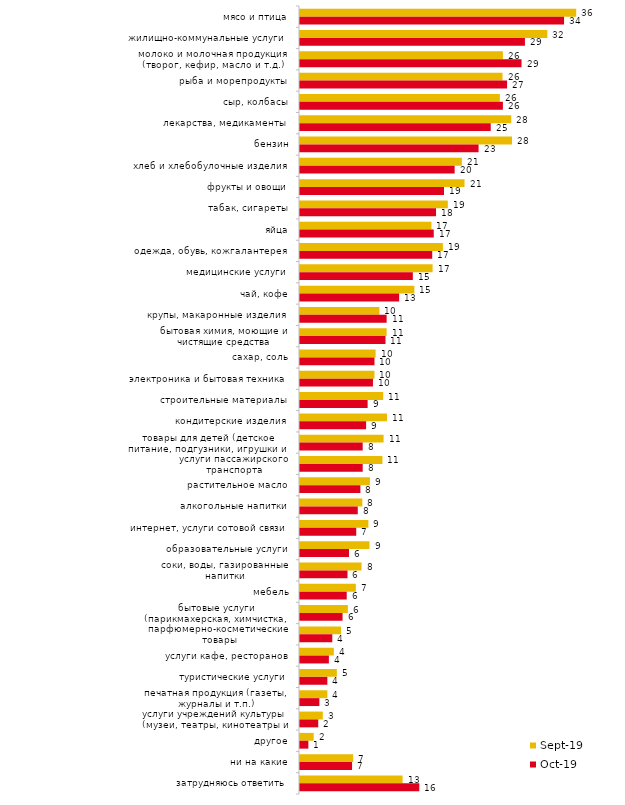
| Category | сен.19 | окт.19 |
|---|---|---|
| мясо и птица | 35.99 | 34.406 |
| жилищно-коммунальные услуги | 32.228 | 29.307 |
| молоко и молочная продукция (творог, кефир, масло и т.д.) | 26.436 | 28.861 |
| рыба и морепродукты | 26.386 | 26.98 |
| сыр, колбасы | 26.04 | 26.436 |
| лекарства, медикаменты | 27.525 | 24.851 |
| бензин | 27.624 | 23.267 |
| хлеб и хлебобулочные изделия | 21.089 | 20.149 |
| фрукты и овощи | 21.436 | 18.762 |
| табак, сигареты | 19.257 | 17.723 |
| яйца | 17.129 | 17.426 |
| одежда, обувь, кожгалантерея | 18.614 | 17.228 |
| медицинские услуги | 17.277 | 14.703 |
| чай, кофе | 14.901 | 12.921 |
| крупы, макаронные изделия | 10.347 | 11.287 |
| бытовая химия, моющие и чистящие средства | 11.287 | 11.139 |
| сахар, соль | 9.851 | 9.703 |
| электроника и бытовая техника | 9.703 | 9.505 |
| строительные материалы | 10.842 | 8.812 |
| кондитерские изделия | 11.337 | 8.614 |
| товары для детей (детское питание, подгузники, игрушки и т.п.) | 10.891 | 8.168 |
| услуги пассажирского транспорта | 10.743 | 8.168 |
| растительное масло | 9.109 | 7.871 |
| алкогольные напитки | 8.119 | 7.525 |
| интернет, услуги сотовой связи | 8.911 | 7.327 |
| образовательные услуги | 9.059 | 6.386 |
| соки, воды, газированные напитки | 8.02 | 6.188 |
| мебель | 7.277 | 6.089 |
| бытовые услуги (парикмахерская, химчистка, ателье и т.д.) | 6.238 | 5.545 |
| парфюмерно-косметические товары | 5.347 | 4.208 |
| услуги кафе, ресторанов | 4.406 | 3.762 |
| туристические услуги | 4.802 | 3.564 |
| печатная продукция (газеты, журналы и т.п.) | 3.564 | 2.525 |
| услуги учреждений культуры (музеи, театры, кинотеатры и т.п.) | 2.97 | 2.376 |
| другое | 1.782 | 1.089 |
| ни на какие | 6.931 | 6.782 |
| затрудняюсь ответить | 13.366 | 15.545 |